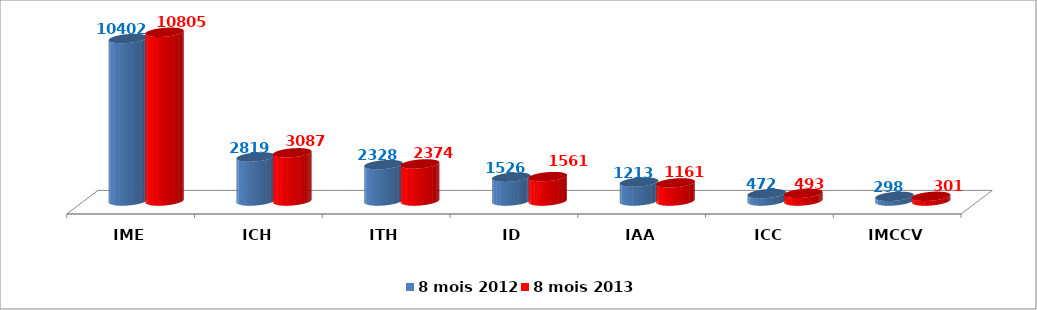
| Category | 8 mois 2012 | 8 mois 2013 |
|---|---|---|
| IME | 10402 | 10805.38 |
| ICH | 2819.169 | 3086.506 |
| ITH | 2327.8 | 2374.2 |
| ID | 1525.974 | 1561.383 |
| IAA | 1213.085 | 1161.205 |
| ICC | 471.5 | 492.5 |
| IMCCV | 297.516 | 301.421 |